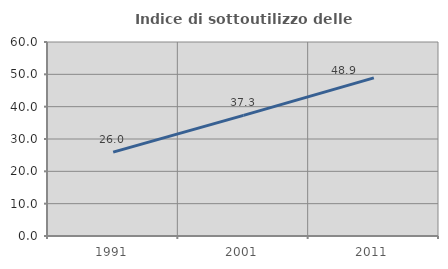
| Category | Indice di sottoutilizzo delle abitazioni  |
|---|---|
| 1991.0 | 25.955 |
| 2001.0 | 37.321 |
| 2011.0 | 48.908 |